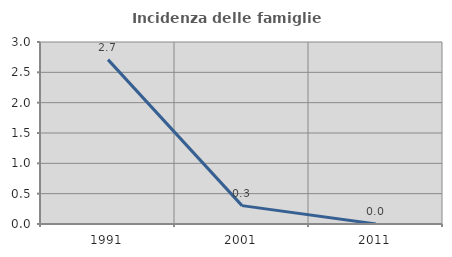
| Category | Incidenza delle famiglie numerose |
|---|---|
| 1991.0 | 2.709 |
| 2001.0 | 0.303 |
| 2011.0 | 0 |